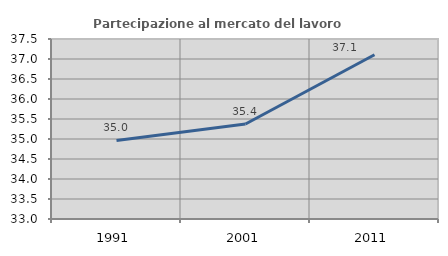
| Category | Partecipazione al mercato del lavoro  femminile |
|---|---|
| 1991.0 | 34.965 |
| 2001.0 | 35.374 |
| 2011.0 | 37.107 |